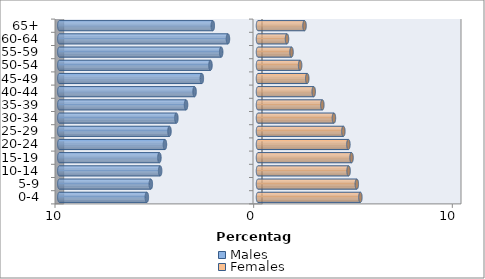
| Category | Males | Females |
|---|---|---|
| 0-4 | -5.595 | 5.154 |
| 5-9 | -5.395 | 4.974 |
| 10-14 | -4.926 | 4.56 |
| 15-19 | -4.963 | 4.708 |
| 20-24 | -4.684 | 4.55 |
| 25-29 | -4.456 | 4.297 |
| 30-34 | -4.109 | 3.822 |
| 35-39 | -3.622 | 3.239 |
| 40-44 | -3.193 | 2.804 |
| 45-49 | -2.826 | 2.479 |
| 50-54 | -2.393 | 2.12 |
| 55-59 | -1.854 | 1.688 |
| 60-64 | -1.512 | 1.46 |
| 65+ | -2.275 | 2.342 |